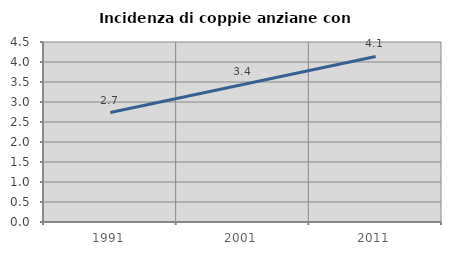
| Category | Incidenza di coppie anziane con figli |
|---|---|
| 1991.0 | 2.737 |
| 2001.0 | 3.439 |
| 2011.0 | 4.139 |